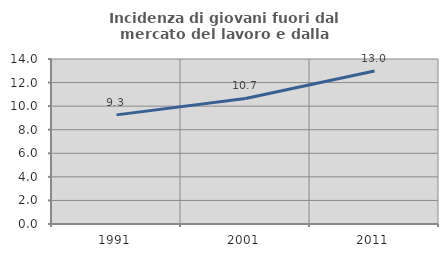
| Category | Incidenza di giovani fuori dal mercato del lavoro e dalla formazione  |
|---|---|
| 1991.0 | 9.259 |
| 2001.0 | 10.656 |
| 2011.0 | 12.987 |